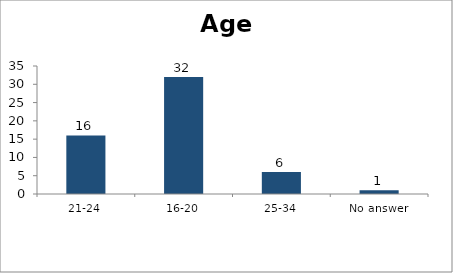
| Category | Age |
|---|---|
| 21-24 | 16 |
| 16-20 | 32 |
| 25-34 | 6 |
| No answer | 1 |